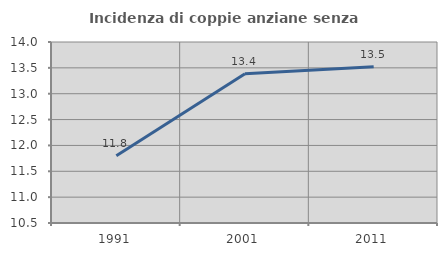
| Category | Incidenza di coppie anziane senza figli  |
|---|---|
| 1991.0 | 11.8 |
| 2001.0 | 13.384 |
| 2011.0 | 13.523 |